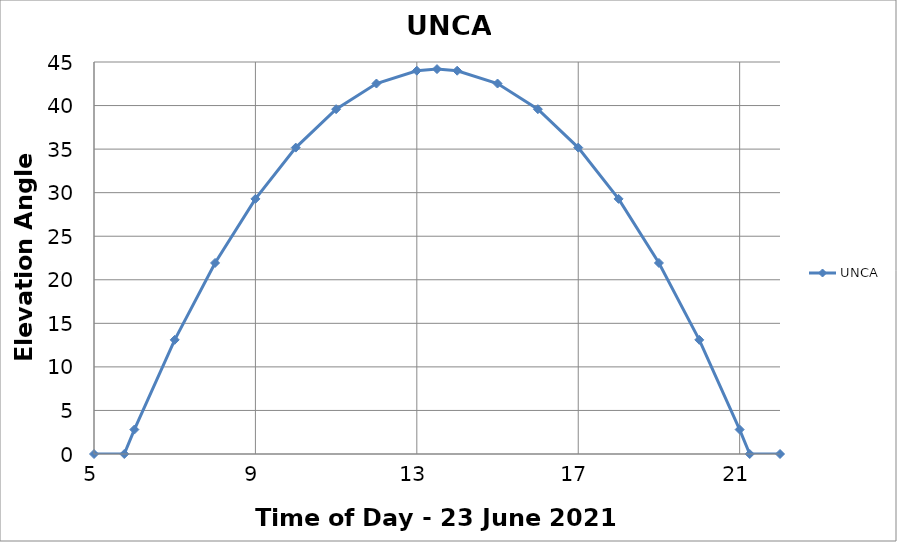
| Category | UNCA |
|---|---|
| 5.0 | 0 |
| 5.75 | 0 |
| 6.0 | 2.805 |
| 7.0 | 13.103 |
| 8.0 | 21.931 |
| 9.0 | 29.287 |
| 10.0 | 35.172 |
| 11.0 | 39.586 |
| 12.0 | 42.529 |
| 13.0 | 44 |
| 13.5 | 44.184 |
| 14.0 | 44 |
| 15.0 | 42.529 |
| 16.0 | 39.586 |
| 17.0 | 35.172 |
| 18.0 | 29.287 |
| 19.0 | 21.931 |
| 20.0 | 13.103 |
| 21.0 | 2.805 |
| 21.25 | 0 |
| 22.0 | 0 |